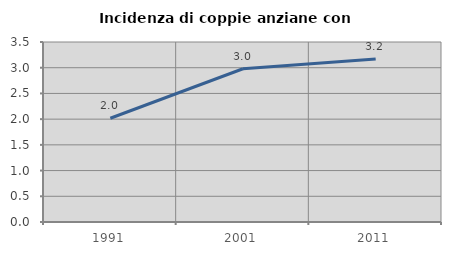
| Category | Incidenza di coppie anziane con figli |
|---|---|
| 1991.0 | 2.018 |
| 2001.0 | 2.979 |
| 2011.0 | 3.168 |